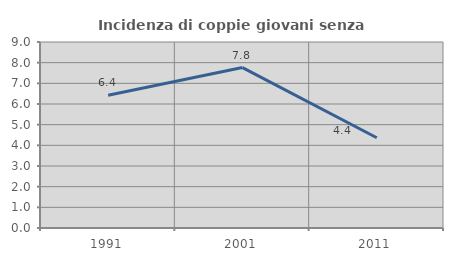
| Category | Incidenza di coppie giovani senza figli |
|---|---|
| 1991.0 | 6.427 |
| 2001.0 | 7.764 |
| 2011.0 | 4.368 |